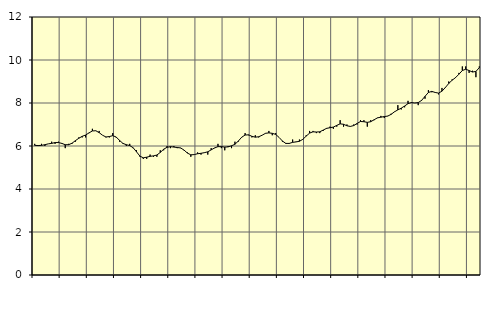
| Category | Piggar | Offentlig förvaltning m.m., SNI 84, 99 |
|---|---|---|
| nan | 6.1 | 6.03 |
| 87.0 | 6 | 6.02 |
| 87.0 | 6.1 | 6.03 |
| 87.0 | 6 | 6.06 |
| nan | 6.1 | 6.1 |
| 88.0 | 6.2 | 6.12 |
| 88.0 | 6.1 | 6.16 |
| 88.0 | 6.2 | 6.16 |
| nan | 6.1 | 6.12 |
| 89.0 | 5.9 | 6.06 |
| 89.0 | 6.1 | 6.06 |
| 89.0 | 6.1 | 6.13 |
| nan | 6.2 | 6.25 |
| 90.0 | 6.4 | 6.36 |
| 90.0 | 6.4 | 6.45 |
| 90.0 | 6.4 | 6.51 |
| nan | 6.6 | 6.61 |
| 91.0 | 6.8 | 6.7 |
| 91.0 | 6.7 | 6.71 |
| 91.0 | 6.7 | 6.62 |
| nan | 6.5 | 6.5 |
| 92.0 | 6.4 | 6.42 |
| 92.0 | 6.4 | 6.44 |
| 92.0 | 6.6 | 6.48 |
| nan | 6.4 | 6.42 |
| 93.0 | 6.2 | 6.26 |
| 93.0 | 6.1 | 6.12 |
| 93.0 | 6 | 6.06 |
| nan | 6.1 | 6.02 |
| 94.0 | 5.9 | 5.92 |
| 94.0 | 5.8 | 5.73 |
| 94.0 | 5.5 | 5.53 |
| nan | 5.4 | 5.45 |
| 95.0 | 5.4 | 5.48 |
| 95.0 | 5.6 | 5.52 |
| 95.0 | 5.5 | 5.54 |
| nan | 5.5 | 5.58 |
| 96.0 | 5.8 | 5.7 |
| 96.0 | 5.8 | 5.85 |
| 96.0 | 6 | 5.94 |
| nan | 5.9 | 5.97 |
| 97.0 | 6 | 5.95 |
| 97.0 | 5.9 | 5.93 |
| 97.0 | 5.9 | 5.91 |
| nan | 5.8 | 5.81 |
| 98.0 | 5.7 | 5.67 |
| 98.0 | 5.5 | 5.59 |
| 98.0 | 5.6 | 5.6 |
| nan | 5.7 | 5.64 |
| 99.0 | 5.6 | 5.66 |
| 99.0 | 5.7 | 5.69 |
| 99.0 | 5.6 | 5.73 |
| nan | 5.9 | 5.82 |
| 0.0 | 5.9 | 5.91 |
| 0.0 | 6.1 | 5.97 |
| 0.0 | 5.9 | 5.97 |
| nan | 5.8 | 5.95 |
| 1.0 | 6 | 5.96 |
| 1.0 | 5.9 | 6.01 |
| 1.0 | 6.2 | 6.08 |
| nan | 6.2 | 6.23 |
| 2.0 | 6.4 | 6.41 |
| 2.0 | 6.6 | 6.51 |
| 2.0 | 6.5 | 6.52 |
| nan | 6.4 | 6.45 |
| 3.0 | 6.5 | 6.41 |
| 3.0 | 6.4 | 6.43 |
| 3.0 | 6.5 | 6.5 |
| nan | 6.6 | 6.59 |
| 4.0 | 6.7 | 6.61 |
| 4.0 | 6.5 | 6.59 |
| 4.0 | 6.6 | 6.54 |
| nan | 6.4 | 6.4 |
| 5.0 | 6.2 | 6.23 |
| 5.0 | 6.1 | 6.12 |
| 5.0 | 6.1 | 6.12 |
| nan | 6.3 | 6.17 |
| 6.0 | 6.2 | 6.19 |
| 6.0 | 6.3 | 6.22 |
| 6.0 | 6.3 | 6.31 |
| nan | 6.5 | 6.46 |
| 7.0 | 6.7 | 6.6 |
| 7.0 | 6.7 | 6.66 |
| 7.0 | 6.6 | 6.65 |
| nan | 6.6 | 6.66 |
| 8.0 | 6.7 | 6.74 |
| 8.0 | 6.8 | 6.82 |
| 8.0 | 6.9 | 6.85 |
| nan | 6.8 | 6.88 |
| 9.0 | 6.9 | 6.96 |
| 9.0 | 7.2 | 7.03 |
| 9.0 | 6.9 | 7.01 |
| nan | 7 | 6.94 |
| 10.0 | 6.9 | 6.91 |
| 10.0 | 7 | 6.95 |
| 10.0 | 7 | 7.05 |
| nan | 7.2 | 7.14 |
| 11.0 | 7.2 | 7.13 |
| 11.0 | 6.9 | 7.1 |
| 11.0 | 7.2 | 7.13 |
| nan | 7.2 | 7.22 |
| 12.0 | 7.3 | 7.31 |
| 12.0 | 7.4 | 7.34 |
| 12.0 | 7.3 | 7.37 |
| nan | 7.4 | 7.39 |
| 13.0 | 7.5 | 7.47 |
| 13.0 | 7.6 | 7.59 |
| 13.0 | 7.9 | 7.68 |
| nan | 7.7 | 7.76 |
| 14.0 | 7.8 | 7.86 |
| 14.0 | 8.1 | 7.97 |
| 14.0 | 8 | 8.02 |
| nan | 8 | 8 |
| 15.0 | 7.9 | 8.02 |
| 15.0 | 8.1 | 8.12 |
| 15.0 | 8.2 | 8.31 |
| nan | 8.6 | 8.49 |
| 16.0 | 8.5 | 8.54 |
| 16.0 | 8.5 | 8.49 |
| 16.0 | 8.4 | 8.46 |
| nan | 8.7 | 8.55 |
| 17.0 | 8.7 | 8.72 |
| 17.0 | 9 | 8.91 |
| 17.0 | 9.1 | 9.06 |
| nan | 9.2 | 9.18 |
| 18.0 | 9.4 | 9.34 |
| 18.0 | 9.7 | 9.51 |
| 18.0 | 9.7 | 9.57 |
| nan | 9.4 | 9.51 |
| 19.0 | 9.5 | 9.44 |
| 19.0 | 9.2 | 9.47 |
| 19.0 | 9.7 | 9.64 |